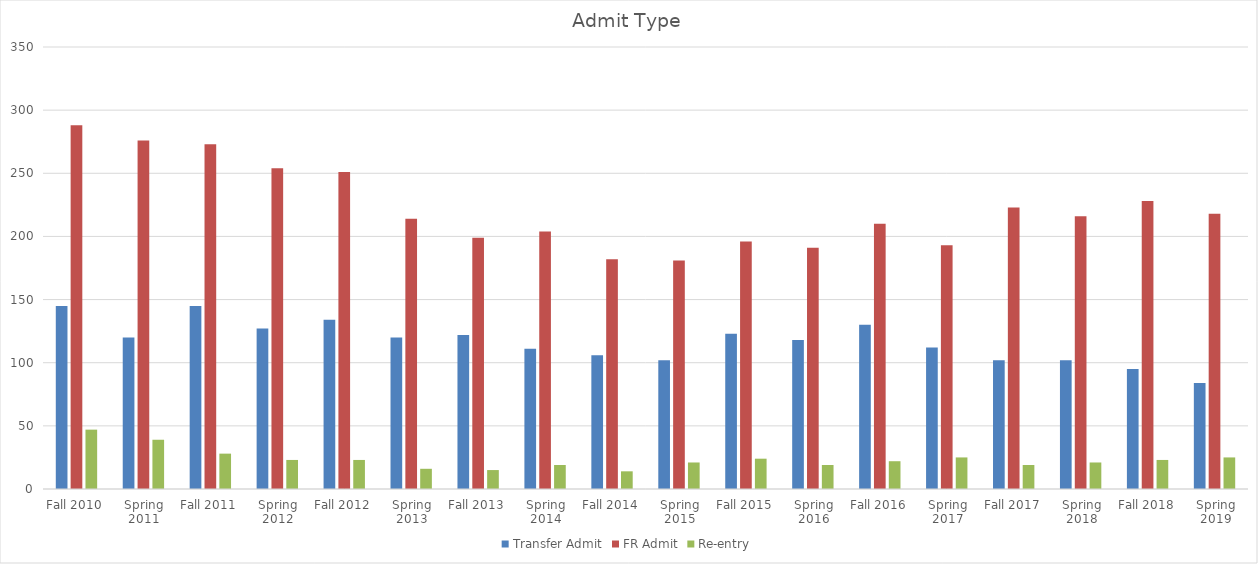
| Category | Transfer Admit | FR Admit | Re-entry |
|---|---|---|---|
| Fall 2010 | 145 | 288 | 47 |
| Spring 2011 | 120 | 276 | 39 |
| Fall 2011 | 145 | 273 | 28 |
| Spring 2012 | 127 | 254 | 23 |
| Fall 2012 | 134 | 251 | 23 |
| Spring 2013 | 120 | 214 | 16 |
| Fall 2013 | 122 | 199 | 15 |
| Spring 2014 | 111 | 204 | 19 |
| Fall 2014 | 106 | 182 | 14 |
| Spring 2015 | 102 | 181 | 21 |
| Fall 2015 | 123 | 196 | 24 |
| Spring 2016 | 118 | 191 | 19 |
| Fall 2016 | 130 | 210 | 22 |
| Spring 2017 | 112 | 193 | 25 |
| Fall 2017 | 102 | 223 | 19 |
| Spring 2018 | 102 | 216 | 21 |
| Fall 2018 | 95 | 228 | 23 |
| Spring 2019 | 84 | 218 | 25 |